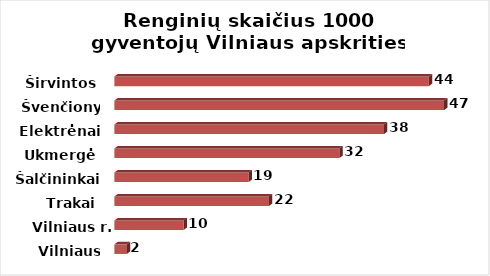
| Category | Series 0 |
|---|---|
| Vilniaus m. | 1.763 |
| Vilniaus r. | 9.77 |
| Trakai | 21.805 |
| Šalčininkai | 18.944 |
| Ukmergė | 31.748 |
| Elektrėnai | 38.03 |
| Švenčionys | 46.505 |
| Širvintos | 44.357 |